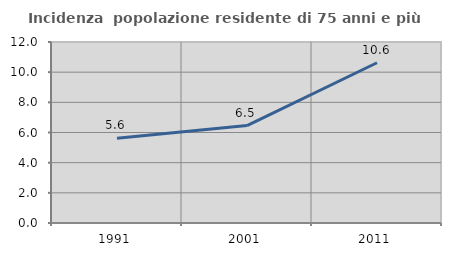
| Category | Incidenza  popolazione residente di 75 anni e più |
|---|---|
| 1991.0 | 5.615 |
| 2001.0 | 6.457 |
| 2011.0 | 10.626 |